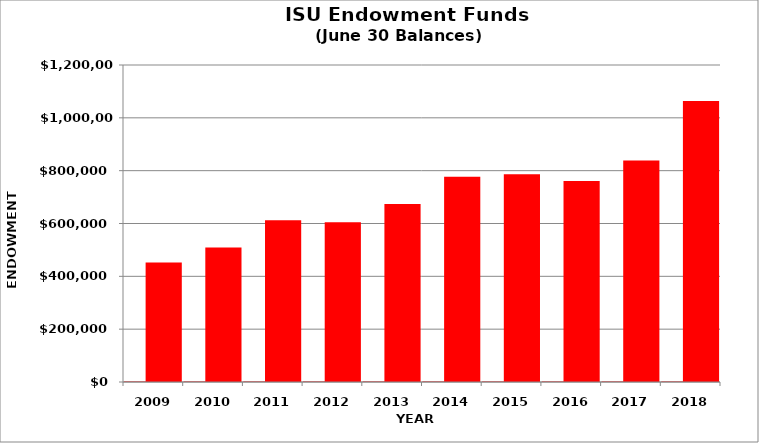
| Category | 2007 | Series 1 |
|---|---|---|
| 2009.0 | 2009 | 452209 |
| 2010.0 | 2010 | 508875 |
| 2011.0 | 2011 | 612283 |
| 2012.0 | 2012 | 604897 |
| 2013.0 | 2013 | 673515 |
| 2014.0 | 2014 | 777018 |
| 2015.0 | 2015 | 786205 |
| 2016.0 | 2016 | 760461 |
| 2017.0 | 2017 | 838871 |
| 2018.0 | 2018 | 1063772 |